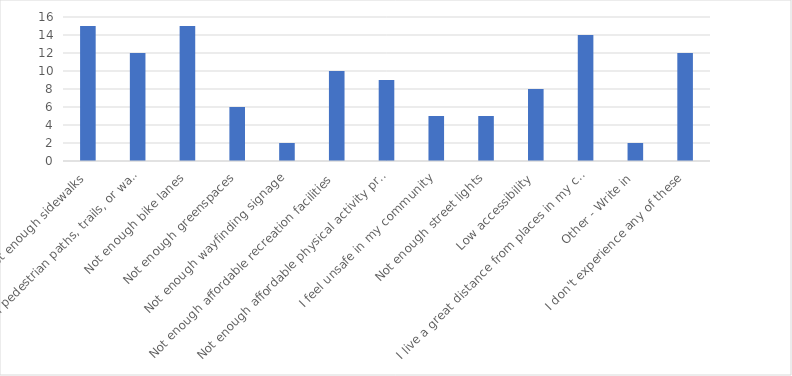
| Category | Number of Responses |
|---|---|
| Not enough sidewalks | 15 |
| Not enough pedestrian paths, trails, or walkways | 12 |
| Not enough bike lanes | 15 |
| Not enough greenspaces | 6 |
| Not enough wayfinding signage | 2 |
| Not enough affordable recreation facilities | 10 |
| Not enough affordable physical activity programs | 9 |
| I feel unsafe in my community | 5 |
| Not enough street lights | 5 |
| Low accessibility | 8 |
| I live a great distance from places in my community | 14 |
| Other - Write in | 2 |
| I don't experience any of these | 12 |